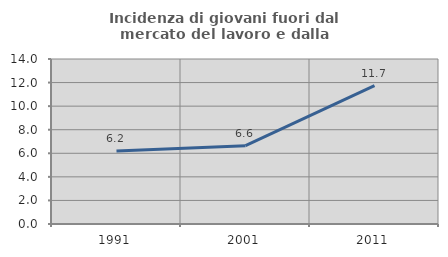
| Category | Incidenza di giovani fuori dal mercato del lavoro e dalla formazione  |
|---|---|
| 1991.0 | 6.197 |
| 2001.0 | 6.643 |
| 2011.0 | 11.735 |